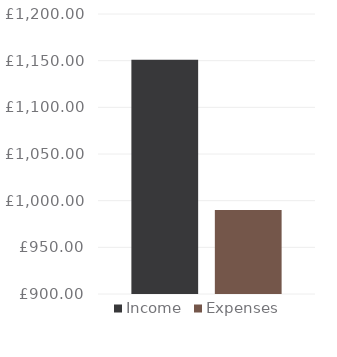
| Category | Income | Expenses |
|---|---|---|
| 0 | 1150.99 | 990.08 |